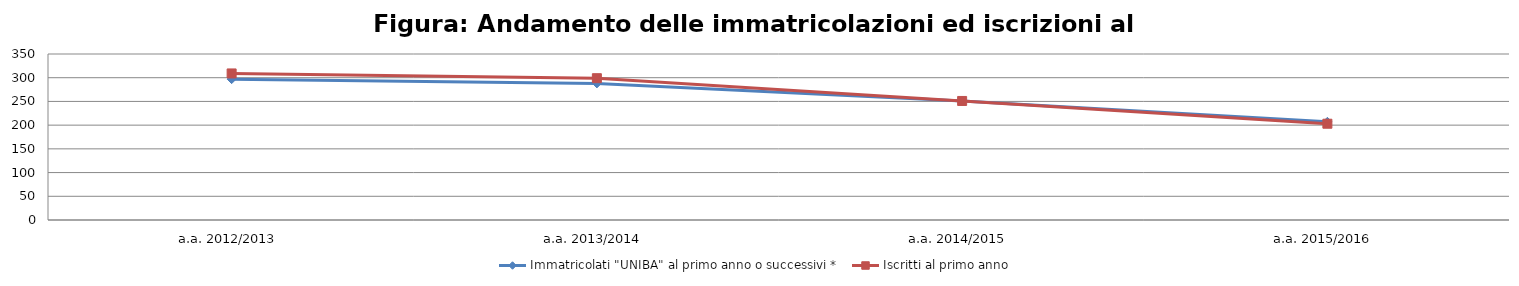
| Category | Immatricolati "UNIBA" al primo anno o successivi * | Iscritti al primo anno  |
|---|---|---|
| a.a. 2012/2013 | 297 | 309 |
| a.a. 2013/2014 | 288 | 299 |
| a.a. 2014/2015 | 251 | 251 |
| a.a. 2015/2016 | 207 | 203 |